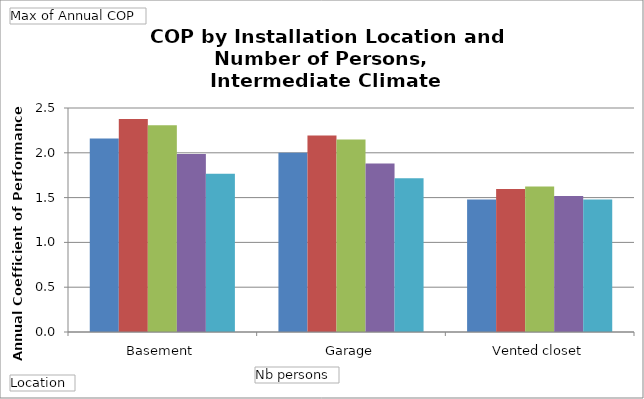
| Category | 1 | 2 | 3 | 4 | 5+ |
|---|---|---|---|---|---|
| Basement | 2.16 | 2.378 | 2.309 | 1.987 | 1.768 |
| Garage | 2.001 | 2.193 | 2.149 | 1.88 | 1.715 |
| Vented closet | 1.479 | 1.597 | 1.624 | 1.519 | 1.478 |